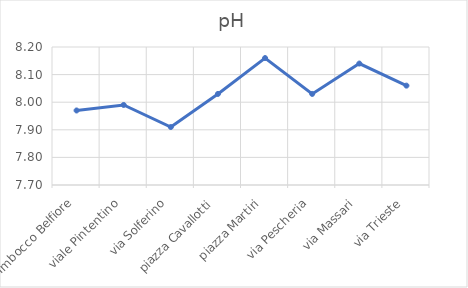
| Category |  pH |
|---|---|
| Imbocco Belfiore | 7.97 |
| viale Pintentino | 7.99 |
| via Solferino | 7.91 |
| piazza Cavallotti | 8.03 |
| piazza Martiri | 8.16 |
| via Pescheria | 8.03 |
| via Massari | 8.14 |
| via Trieste | 8.06 |